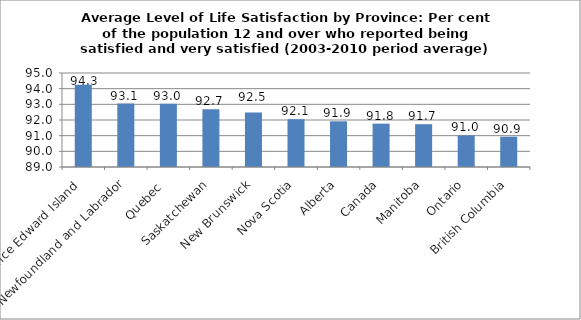
| Category | 2003-2010 average |
|---|---|
| Prince Edward Island  | 94.25 |
| Newfoundland and Labrador | 93.05 |
| Quebec  | 93.033 |
| Saskatchewan | 92.683 |
| New Brunswick | 92.483 |
| Nova Scotia | 92.05 |
| Alberta | 91.917 |
| Canada | 91.767 |
| Manitoba | 91.733 |
| Ontario | 91.017 |
| British Columbia | 90.933 |